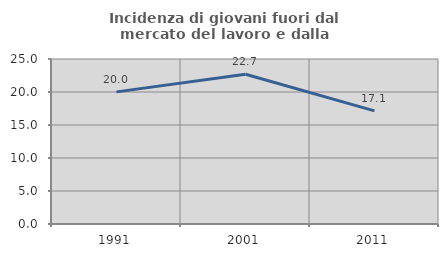
| Category | Incidenza di giovani fuori dal mercato del lavoro e dalla formazione  |
|---|---|
| 1991.0 | 20.018 |
| 2001.0 | 22.688 |
| 2011.0 | 17.142 |